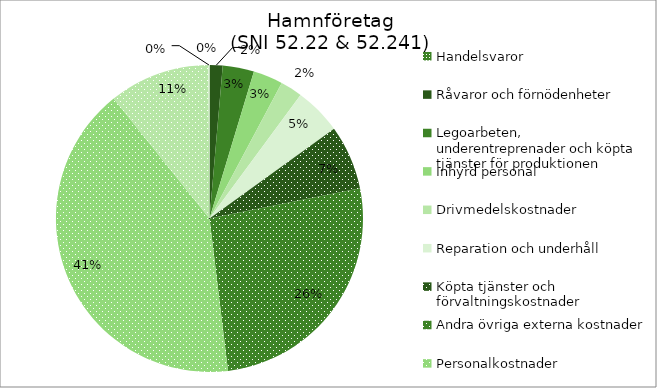
| Category | Series 0 |
|---|---|
| Handelsvaror | 3.51 |
| Råvaror och förnödenheter | 120 |
| Legoarbeten, underentreprenader och köpta tjänster för produktionen | 295.639 |
| Inhyrd personal | 280 |
| Drivmedelskostnader | 207 |
| Reparation och underhåll | 444 |
| Köpta tjänster och förvaltningskostnader | 609 |
| Andra övriga externa kostnader | 2351.808 |
| Personalkostnader | 3694.002 |
| Avskrivningar | 952.143 |
| Övriga rörelsekostnader | 10.054 |